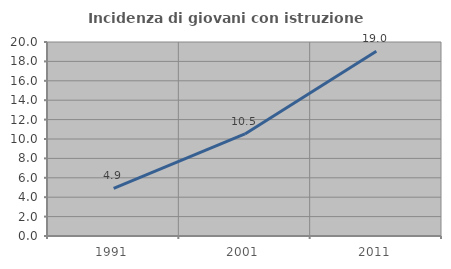
| Category | Incidenza di giovani con istruzione universitaria |
|---|---|
| 1991.0 | 4.918 |
| 2001.0 | 10.526 |
| 2011.0 | 19.048 |